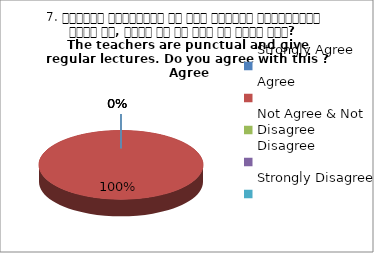
| Category | 7. शिक्षक समयनिष्ट है एवं नियमित व्याख्यान देते है, क्या आप इस बात से सहमत हैं? 
The teachers are punctual and give regular lectures. Do you agree with this ?
 Agree |
|---|---|
| Strongly Agree | 0 |
| Agree | 1 |
| Not Agree & Not Disagree | 0 |
| Disagree | 0 |
| Strongly Disagree | 0 |